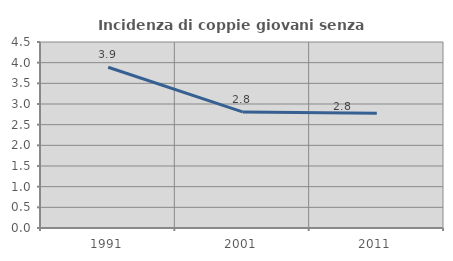
| Category | Incidenza di coppie giovani senza figli |
|---|---|
| 1991.0 | 3.889 |
| 2001.0 | 2.808 |
| 2011.0 | 2.778 |